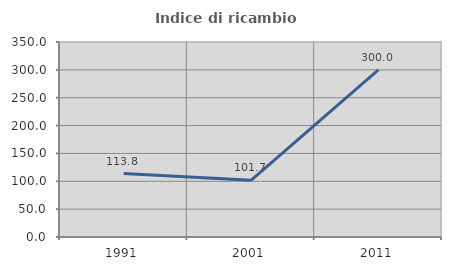
| Category | Indice di ricambio occupazionale  |
|---|---|
| 1991.0 | 113.793 |
| 2001.0 | 101.695 |
| 2011.0 | 300 |